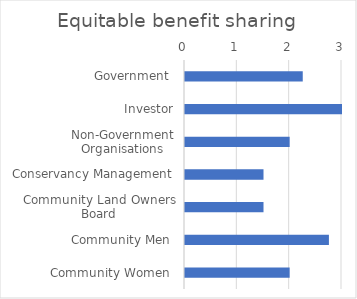
| Category | Equitable benefit sharing |
|---|---|
| Government  | 2.25 |
| Investor | 3 |
| Non-Government Organisations | 2 |
| Conservancy Management | 1.5 |
| Community Land Owners Board | 1.5 |
| Community Men  | 2.75 |
| Community Women  | 2 |